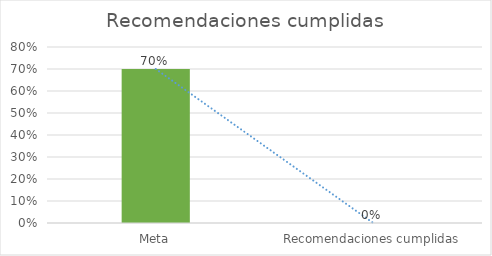
| Category | Series 0 |
|---|---|
| Meta | 0.7 |
| Recomendaciones cumplidas | 0 |